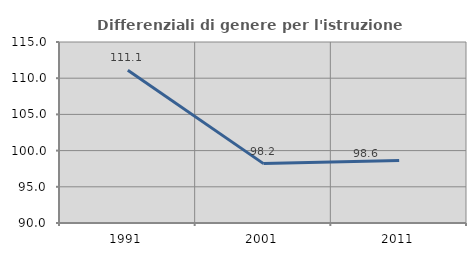
| Category | Differenziali di genere per l'istruzione superiore |
|---|---|
| 1991.0 | 111.099 |
| 2001.0 | 98.202 |
| 2011.0 | 98.619 |